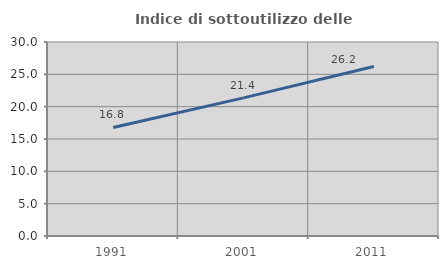
| Category | Indice di sottoutilizzo delle abitazioni  |
|---|---|
| 1991.0 | 16.784 |
| 2001.0 | 21.365 |
| 2011.0 | 26.221 |